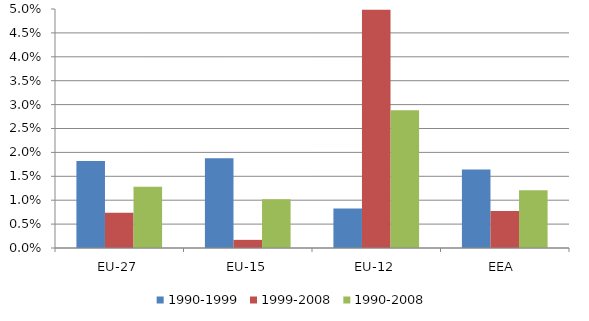
| Category | 1990-1999 | 1999-2008 | 1990-2008 |
|---|---|---|---|
| EU-27 | 0.018 | 0.007 | 0.013 |
| EU-15 | 0.019 | 0.002 | 0.01 |
| EU-12 | 0.008 | 0.05 | 0.029 |
| EEA  | 0.016 | 0.008 | 0.012 |